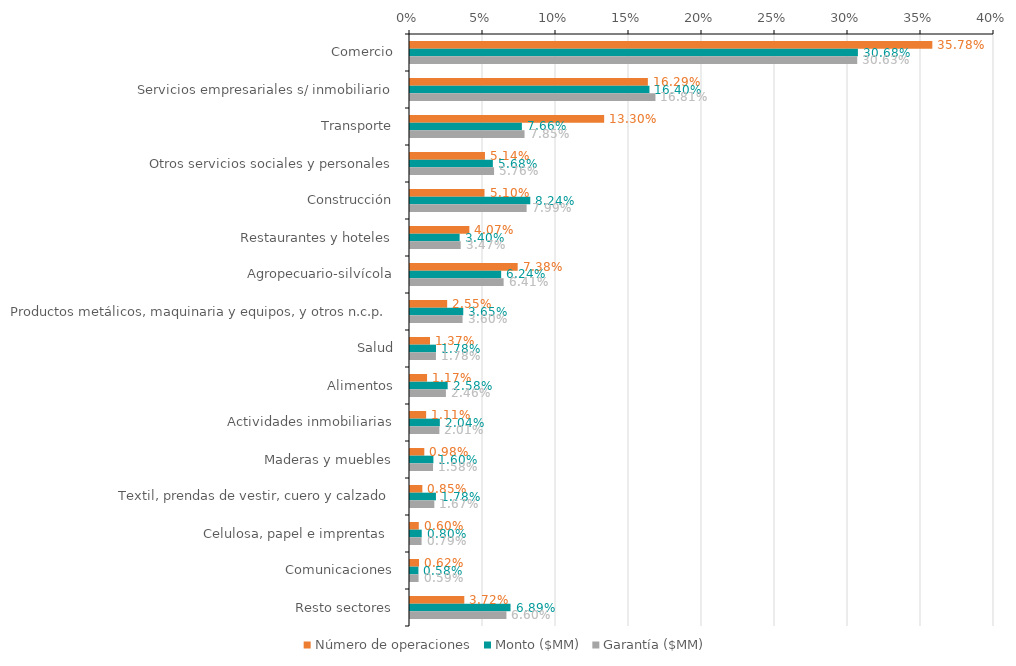
| Category | Número de operaciones | Monto ($MM) | Garantía ($MM) |
|---|---|---|---|
| Comercio | 0.358 | 0.307 | 0.306 |
| Servicios empresariales s/ inmobiliario | 0.163 | 0.164 | 0.168 |
| Transporte | 0.133 | 0.077 | 0.078 |
| Otros servicios sociales y personales | 0.051 | 0.057 | 0.058 |
| Construcción | 0.051 | 0.082 | 0.08 |
| Restaurantes y hoteles | 0.041 | 0.034 | 0.035 |
| Agropecuario-silvícola | 0.074 | 0.062 | 0.064 |
| Productos metálicos, maquinaria y equipos, y otros n.c.p. | 0.025 | 0.036 | 0.036 |
| Salud | 0.014 | 0.018 | 0.018 |
| Alimentos | 0.012 | 0.026 | 0.025 |
| Actividades inmobiliarias | 0.011 | 0.02 | 0.02 |
| Maderas y muebles | 0.01 | 0.016 | 0.016 |
| Textil, prendas de vestir, cuero y calzado | 0.008 | 0.018 | 0.017 |
| Celulosa, papel e imprentas  | 0.006 | 0.008 | 0.008 |
| Comunicaciones | 0.006 | 0.006 | 0.006 |
| Resto sectores | 0.037 | 0.069 | 0.066 |